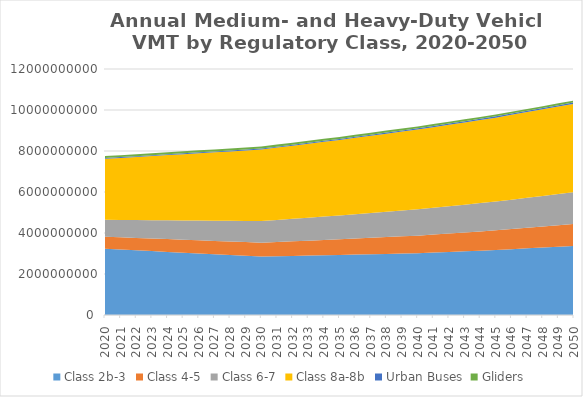
| Category | Class 2b-3 | Class 4-5 | Class 6-7 | Class 8a-8b | Urban Buses | Gliders |
|---|---|---|---|---|---|---|
| 2020.0 | 3232128346.154 | 587225664.385 | 822422973.077 | 2975497112.154 | 39738035.32 | 93375267.615 |
| 2021.0 | 3193737533.538 | 596453865.846 | 845658944.769 | 3026825595.538 | 40490180.228 | 93936461.154 |
| 2022.0 | 3155346720.923 | 605682067.308 | 868894916.462 | 3078154078.923 | 41242325.137 | 94497654.692 |
| 2023.0 | 3116955908.308 | 614910268.769 | 892130888.154 | 3129482562.308 | 41994470.046 | 95058848.231 |
| 2024.0 | 3078565095.692 | 624138470.231 | 915366859.846 | 3180811045.692 | 42746614.954 | 95620041.769 |
| 2025.0 | 3040174283.077 | 633366671.692 | 938602831.538 | 3232139529.077 | 43498759.863 | 96181235.308 |
| 2026.0 | 3001783470.462 | 642594873.154 | 961838803.231 | 3283468012.462 | 44250904.772 | 96742428.846 |
| 2027.0 | 2963392657.846 | 651823074.615 | 985074774.923 | 3334796495.846 | 45003049.68 | 97303622.385 |
| 2028.0 | 2925001845.231 | 661051276.077 | 1008310746.615 | 3386124979.231 | 45755194.589 | 97864815.923 |
| 2029.0 | 2886611032.615 | 670279477.538 | 1031546718.308 | 3437453462.615 | 46507339.498 | 98426009.462 |
| 2030.0 | 2848220220 | 679507679 | 1054782690 | 3488781946 | 47259484.406 | 98987203 |
| 2031.0 | 2864412217.88 | 696525012.495 | 1076899453.256 | 3527018315.141 | 48272742.487 | 98528786.296 |
| 2032.0 | 2880604215.759 | 713542345.99 | 1099016216.513 | 3565254684.282 | 49286000.567 | 98070369.592 |
| 2033.0 | 2896796213.639 | 730559679.485 | 1121132979.769 | 3603491053.424 | 50299258.648 | 97611952.888 |
| 2034.0 | 2912988211.518 | 747577012.98 | 1143249743.025 | 3641727422.565 | 51312516.728 | 97153536.184 |
| 2035.0 | 2929180209.398 | 764594346.475 | 1165366506.281 | 3679963791.706 | 52325774.809 | 96695119.479 |
| 2036.0 | 2945735443.918 | 783547992.78 | 1189624730.225 | 3722059726.965 | 53468286.647 | 96160551.184 |
| 2037.0 | 2962290678.439 | 802501639.085 | 1213882954.169 | 3764155662.224 | 54610798.485 | 95625982.888 |
| 2038.0 | 2978845912.959 | 821455285.39 | 1238141178.113 | 3806251597.482 | 55753310.323 | 95091414.592 |
| 2039.0 | 2995401147.48 | 840408931.695 | 1262399402.056 | 3848347532.741 | 56895822.162 | 94556846.296 |
| 2040.0 | 3011956382 | 859362578 | 1286657626 | 3890443468 | 58038334 | 94022278 |
| 2041.0 | 3043856538.119 | 878960060.101 | 1310317972.381 | 3930997825.089 | 58926999.78 | 93291752.85 |
| 2042.0 | 3075756694.238 | 898557542.202 | 1333978318.763 | 3971552182.177 | 59815665.56 | 92561227.7 |
| 2043.0 | 3107656850.357 | 918155024.302 | 1357638665.144 | 4012106539.266 | 60704331.34 | 91830702.55 |
| 2044.0 | 3139557006.476 | 937752506.403 | 1381299011.525 | 4052660896.355 | 61592997.12 | 91100177.4 |
| 2045.0 | 3171457162.595 | 957349988.504 | 1404959357.907 | 4093215253.443 | 62481662.901 | 90369652.25 |
| 2046.0 | 3211811275.676 | 980642972.003 | 1433247258.325 | 4137157482.755 | 63434026.502 | 89843988.6 |
| 2047.0 | 3252165388.757 | 1003935955.502 | 1461535158.744 | 4181099712.066 | 64386390.103 | 89318324.95 |
| 2048.0 | 3292519501.838 | 1027228939.002 | 1489823059.163 | 4225041941.377 | 65338753.704 | 88792661.3 |
| 2049.0 | 3332873614.919 | 1050521922.501 | 1518110959.581 | 4268984170.689 | 66291117.305 | 88266997.65 |
| 2050.0 | 3373227728 | 1073814906 | 1546398860 | 4312926400 | 67243480.906 | 87741334 |